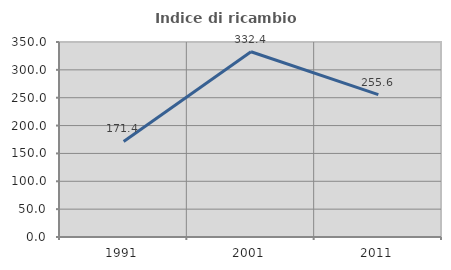
| Category | Indice di ricambio occupazionale  |
|---|---|
| 1991.0 | 171.429 |
| 2001.0 | 332.432 |
| 2011.0 | 255.556 |